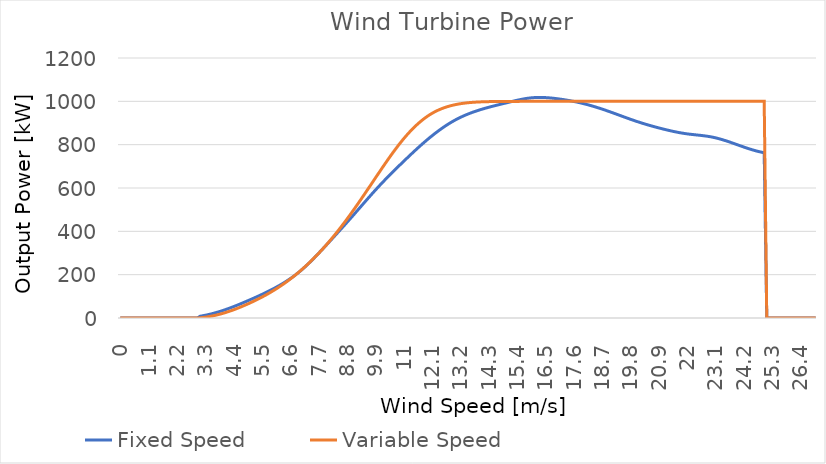
| Category | Fixed Speed | Variable Speed |
|---|---|---|
| 0.0 | 0 | 0 |
| 0.1 | 0 | 0 |
| 0.2 | 0 | 0 |
| 0.3 | 0 | 0 |
| 0.4 | 0 | 0 |
| 0.5 | 0 | 0 |
| 0.6 | 0 | 0 |
| 0.7 | 0 | 0 |
| 0.8 | 0 | 0 |
| 0.9 | 0 | 0 |
| 1.0 | 0 | 0 |
| 1.1 | 0 | 0 |
| 1.2 | 0 | 0 |
| 1.3 | 0 | 0 |
| 1.4 | 0 | 0 |
| 1.5 | 0 | 0 |
| 1.6 | 0 | 0 |
| 1.7 | 0 | 0 |
| 1.8 | 0 | 0 |
| 1.9 | 0 | 0 |
| 2.0 | 0 | 0 |
| 2.1 | 0 | 0 |
| 2.2 | 0 | 0 |
| 2.3 | 0 | 0 |
| 2.4 | 0 | 0 |
| 2.5 | 0 | 0 |
| 2.6 | 0 | 0 |
| 2.7 | 0 | 0 |
| 2.8 | 0 | 0 |
| 2.9 | 0 | 0 |
| 3.0 | 0 | 0 |
| 3.1 | 8.272 | 0.981 |
| 3.2 | 10.317 | 2.246 |
| 3.3 | 12.624 | 3.79 |
| 3.4 | 15.184 | 5.608 |
| 3.5 | 17.988 | 7.697 |
| 3.6 | 21.026 | 10.052 |
| 3.7 | 24.289 | 12.669 |
| 3.8 | 27.768 | 15.544 |
| 3.9 | 31.452 | 18.672 |
| 4.0 | 35.333 | 22.05 |
| 4.1 | 39.4 | 25.672 |
| 4.2 | 43.641 | 29.527 |
| 4.3 | 48.042 | 33.606 |
| 4.4 | 52.588 | 37.898 |
| 4.5 | 57.267 | 42.391 |
| 4.6 | 62.065 | 47.075 |
| 4.7 | 66.967 | 51.939 |
| 4.8 | 71.961 | 56.971 |
| 4.9 | 77.032 | 62.162 |
| 5.0 | 82.167 | 67.5 |
| 5.1 | 87.357 | 72.978 |
| 5.2 | 92.611 | 78.606 |
| 5.3 | 97.943 | 84.394 |
| 5.4 | 103.369 | 90.357 |
| 5.5 | 108.901 | 96.507 |
| 5.6 | 114.555 | 102.857 |
| 5.7 | 120.344 | 109.418 |
| 5.8 | 126.283 | 116.204 |
| 5.9 | 132.386 | 123.227 |
| 6.0 | 138.667 | 130.5 |
| 6.1 | 145.144 | 138.034 |
| 6.2 | 151.848 | 145.836 |
| 6.3 | 158.814 | 153.91 |
| 6.4 | 166.077 | 162.263 |
| 6.5 | 173.672 | 170.898 |
| 6.6 | 181.632 | 179.822 |
| 6.7 | 189.994 | 189.038 |
| 6.8 | 198.792 | 198.554 |
| 6.9 | 208.06 | 208.372 |
| 7.0 | 217.833 | 218.5 |
| 7.1 | 228.132 | 228.941 |
| 7.2 | 238.92 | 239.699 |
| 7.3 | 250.145 | 250.776 |
| 7.4 | 261.757 | 262.175 |
| 7.5 | 273.704 | 273.9 |
| 7.6 | 285.934 | 285.953 |
| 7.7 | 298.397 | 298.336 |
| 7.8 | 311.041 | 311.053 |
| 7.9 | 323.814 | 324.107 |
| 8.0 | 336.667 | 337.5 |
| 8.1 | 349.557 | 351.233 |
| 8.2 | 362.481 | 365.302 |
| 8.3 | 375.447 | 379.697 |
| 8.4 | 388.463 | 394.412 |
| 8.5 | 401.535 | 409.44 |
| 8.6 | 414.671 | 424.772 |
| 8.7 | 427.878 | 440.402 |
| 8.8 | 441.164 | 456.321 |
| 8.9 | 454.535 | 472.523 |
| 9.0 | 468 | 489 |
| 9.1 | 481.558 | 505.74 |
| 9.2 | 495.184 | 522.715 |
| 9.3 | 508.844 | 539.891 |
| 9.4 | 522.506 | 557.236 |
| 9.5 | 536.137 | 574.717 |
| 9.6 | 549.703 | 592.3 |
| 9.7 | 563.172 | 609.953 |
| 9.8 | 576.511 | 627.642 |
| 9.9 | 589.687 | 645.336 |
| 10.0 | 602.667 | 663 |
| 10.1 | 615.426 | 680.598 |
| 10.2 | 627.974 | 698.079 |
| 10.3 | 640.328 | 715.385 |
| 10.4 | 652.505 | 732.463 |
| 10.5 | 664.523 | 749.256 |
| 10.6 | 676.399 | 765.708 |
| 10.7 | 688.151 | 781.765 |
| 10.8 | 699.795 | 797.369 |
| 10.9 | 711.35 | 812.466 |
| 11.0 | 722.833 | 827 |
| 11.1 | 734.255 | 840.923 |
| 11.2 | 745.6 | 854.219 |
| 11.3 | 756.847 | 866.879 |
| 11.4 | 767.974 | 878.895 |
| 11.5 | 778.959 | 890.259 |
| 11.6 | 789.781 | 900.962 |
| 11.7 | 800.418 | 910.996 |
| 11.8 | 810.848 | 920.353 |
| 11.9 | 821.049 | 929.024 |
| 12.0 | 831 | 937 |
| 12.1 | 840.68 | 944.282 |
| 12.2 | 850.076 | 950.899 |
| 12.3 | 859.175 | 956.889 |
| 12.4 | 867.965 | 962.292 |
| 12.5 | 876.432 | 967.145 |
| 12.6 | 884.565 | 971.487 |
| 12.7 | 892.35 | 975.354 |
| 12.8 | 899.776 | 978.787 |
| 12.9 | 906.83 | 981.823 |
| 13.0 | 913.5 | 984.5 |
| 13.1 | 919.778 | 986.854 |
| 13.2 | 925.682 | 988.911 |
| 13.3 | 931.235 | 990.694 |
| 13.4 | 936.459 | 992.228 |
| 13.5 | 941.376 | 993.535 |
| 13.6 | 946.01 | 994.64 |
| 13.7 | 950.384 | 995.565 |
| 13.8 | 954.519 | 996.334 |
| 13.9 | 958.439 | 996.971 |
| 14.0 | 962.167 | 997.5 |
| 14.1 | 965.724 | 997.941 |
| 14.2 | 969.132 | 998.306 |
| 14.3 | 972.408 | 998.602 |
| 14.4 | 975.574 | 998.84 |
| 14.5 | 978.648 | 999.026 |
| 14.6 | 981.65 | 999.171 |
| 14.7 | 984.6 | 999.282 |
| 14.8 | 987.518 | 999.368 |
| 14.9 | 990.422 | 999.438 |
| 15.0 | 993.333 | 999.5 |
| 15.1 | 996.26 | 999.561 |
| 15.2 | 999.169 | 999.622 |
| 15.3 | 1002.019 | 999.683 |
| 15.4 | 1004.766 | 999.741 |
| 15.5 | 1007.366 | 999.796 |
| 15.6 | 1009.777 | 999.848 |
| 15.7 | 1011.956 | 999.895 |
| 15.8 | 1013.859 | 999.937 |
| 15.9 | 1015.444 | 999.972 |
| 16.0 | 1016.667 | 1000 |
| 16.1 | 1017.497 | 1000.02 |
| 16.2 | 1017.952 | 1000.033 |
| 16.3 | 1018.059 | 1000.039 |
| 16.4 | 1017.847 | 1000.04 |
| 16.5 | 1017.346 | 1000.038 |
| 16.6 | 1016.584 | 1000.032 |
| 16.7 | 1015.59 | 1000.024 |
| 16.8 | 1014.392 | 1000.016 |
| 16.9 | 1013.019 | 1000.007 |
| 17.0 | 1011.5 | 1000 |
| 17.1 | 1009.858 | 999.995 |
| 17.2 | 1008.094 | 999.991 |
| 17.3 | 1006.203 | 999.99 |
| 17.4 | 1004.18 | 999.989 |
| 17.5 | 1002.02 | 999.99 |
| 17.6 | 999.719 | 999.991 |
| 17.7 | 997.271 | 999.993 |
| 17.8 | 994.672 | 999.996 |
| 17.9 | 991.916 | 999.998 |
| 18.0 | 989 | 1000 |
| 18.1 | 985.92 | 1000.001 |
| 18.2 | 982.683 | 1000.002 |
| 18.3 | 979.297 | 1000.003 |
| 18.4 | 975.771 | 1000.003 |
| 18.5 | 972.114 | 1000.003 |
| 18.6 | 968.335 | 1000.002 |
| 18.7 | 964.442 | 1000.002 |
| 18.8 | 960.444 | 1000.001 |
| 18.9 | 956.349 | 1000.001 |
| 19.0 | 952.167 | 1000 |
| 19.1 | 947.908 | 1000 |
| 19.2 | 943.59 | 999.999 |
| 19.3 | 939.233 | 999.999 |
| 19.4 | 934.857 | 999.999 |
| 19.5 | 930.482 | 999.999 |
| 19.6 | 926.129 | 999.999 |
| 19.7 | 921.818 | 1000 |
| 19.8 | 917.568 | 1000 |
| 19.9 | 913.4 | 1000 |
| 20.0 | 909.333 | 1000 |
| 20.1 | 905.384 | 1000 |
| 20.2 | 901.552 | 1000 |
| 20.3 | 897.831 | 1000 |
| 20.4 | 894.218 | 1000 |
| 20.5 | 890.706 | 1000 |
| 20.6 | 887.291 | 1000 |
| 20.7 | 883.968 | 1000 |
| 20.8 | 880.732 | 1000 |
| 20.9 | 877.577 | 1000 |
| 21.0 | 874.5 | 1000 |
| 21.1 | 871.498 | 1000 |
| 21.2 | 868.581 | 1000 |
| 21.3 | 865.764 | 1000 |
| 21.4 | 863.06 | 1000 |
| 21.5 | 860.484 | 1000 |
| 21.6 | 858.049 | 1000 |
| 21.7 | 855.77 | 1000 |
| 21.8 | 853.659 | 1000 |
| 21.9 | 851.731 | 1000 |
| 22.0 | 850 | 1000 |
| 22.1 | 848.467 | 1000 |
| 22.2 | 847.087 | 1000 |
| 22.3 | 845.8 | 1000 |
| 22.4 | 844.548 | 1000 |
| 22.5 | 843.273 | 1000 |
| 22.6 | 841.916 | 1000 |
| 22.7 | 840.419 | 1000 |
| 22.8 | 838.723 | 1000 |
| 22.9 | 836.769 | 1000 |
| 23.0 | 834.5 | 1000 |
| 23.1 | 831.873 | 1000 |
| 23.2 | 828.91 | 1000 |
| 23.3 | 825.651 | 1000 |
| 23.4 | 822.136 | 1000 |
| 23.5 | 818.402 | 1000 |
| 23.6 | 814.489 | 1000 |
| 23.7 | 810.437 | 1000 |
| 23.8 | 806.284 | 1000 |
| 23.9 | 802.07 | 1000 |
| 24.0 | 797.833 | 1000 |
| 24.1 | 793.613 | 1000 |
| 24.2 | 789.448 | 1000 |
| 24.3 | 785.379 | 1000 |
| 24.4 | 781.443 | 1000 |
| 24.5 | 777.681 | 1000 |
| 24.6 | 774.131 | 1000 |
| 24.7 | 770.832 | 1000 |
| 24.8 | 767.823 | 1000 |
| 24.9 | 765.144 | 1000 |
| 25.0 | 762.833 | 1000 |
| 25.1 | 0 | 0 |
| 25.2 | 0 | 0 |
| 25.3 | 0 | 0 |
| 25.4 | 0 | 0 |
| 25.5 | 0 | 0 |
| 25.6 | 0 | 0 |
| 25.7 | 0 | 0 |
| 25.8 | 0 | 0 |
| 25.9 | 0 | 0 |
| 26.0 | 0 | 0 |
| 26.1 | 0 | 0 |
| 26.2 | 0 | 0 |
| 26.3 | 0 | 0 |
| 26.4 | 0 | 0 |
| 26.5 | 0 | 0 |
| 26.6 | 0 | 0 |
| 26.7 | 0 | 0 |
| 26.8 | 0 | 0 |
| 26.9 | 0 | 0 |
| 27.0 | 0 | 0 |